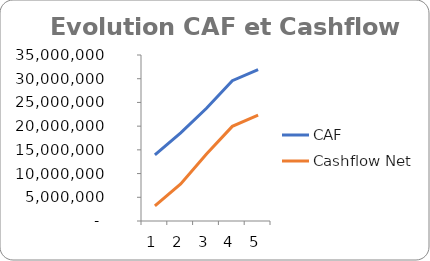
| Category | CAF | Cashflow Net |
|---|---|---|
| 0 | 13929725.333 | 3189043.891 |
| 1 | 18563501.891 | 7822820.449 |
| 2 | 23757965.313 | 14130642.196 |
| 3 | 29580780.927 | 19953457.811 |
| 4 | 31935492.092 | 22308168.975 |